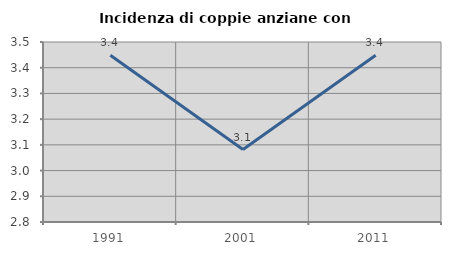
| Category | Incidenza di coppie anziane con figli |
|---|---|
| 1991.0 | 3.448 |
| 2001.0 | 3.082 |
| 2011.0 | 3.448 |